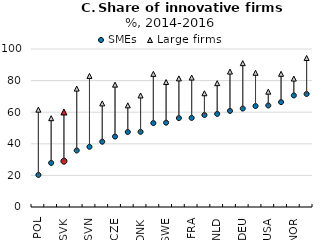
| Category | SMEs | Large firms |
|---|---|---|
| POL | 20.302 | 61.605 |
| HUN | 27.894 | 56.201 |
| SVK | 29.01 | 60.145 |
| ESP | 35.803 | 74.946 |
| SVN | 38.103 | 82.941 |
| JPN | 41.33 | 65.57 |
| CZE | 44.604 | 77.433 |
| KOR | 47.482 | 64.339 |
| DNK | 47.586 | 70.588 |
| ITA | 53.116 | 84.257 |
| SWE | 53.373 | 79.089 |
| IRL | 56.291 | 81.404 |
| FRA | 56.405 | 81.924 |
| GBR | 58.234 | 71.99 |
| NLD | 58.933 | 78.381 |
| AUT | 60.834 | 85.714 |
| DEU | 62.331 | 91.031 |
| FIN | 63.902 | 84.943 |
| USA | 64.268 | 72.993 |
| PRT | 66.4 | 84.298 |
| NOR | 70.623 | 81.285 |
| CHE | 71.545 | 94.31 |